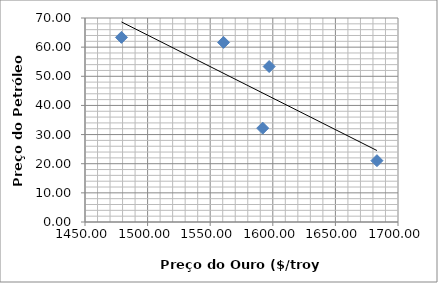
| Category | Series 0 |
|---|---|
| 1479.13 | 63.353 |
| 1560.67 | 61.627 |
| 1597.1 | 53.347 |
| 1591.93 | 32.203 |
| 1683.17 | 21.043 |